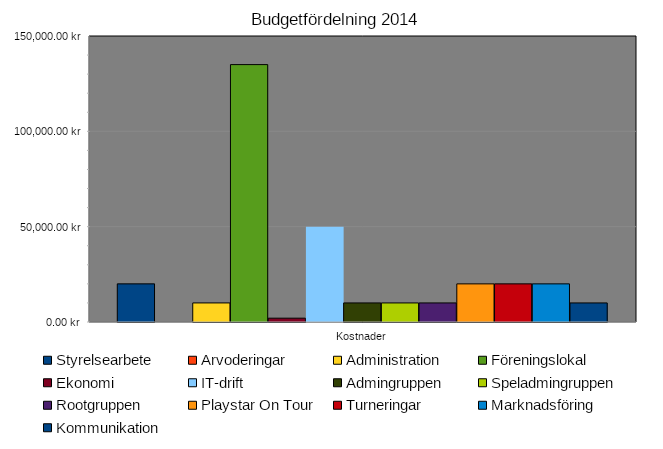
| Category | Styrelsearbete | Arvoderingar | Administration | Föreningslokal | Ekonomi | IT-drift | Admingruppen | Speladmingruppen | Rootgruppen | Playstar On Tour | Turneringar | Marknadsföring | Kommunikation |
|---|---|---|---|---|---|---|---|---|---|---|---|---|---|
| Kostnader | 20000 | 0 | 10000 | 135000 | 2000 | 50000 | 10000 | 10000 | 10000 | 20000 | 20000 | 20000 | 10000 |